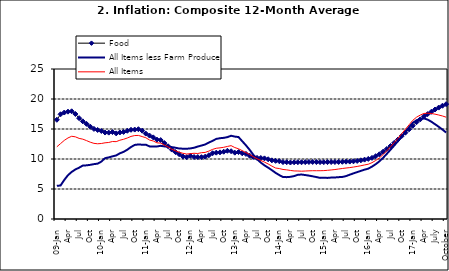
| Category | Food | All Items less Farm Produce | All Items |
|---|---|---|---|
| 09-Jan | 16.536 | 5.519 | 12.032 |
| Feb | 17.454 | 5.591 | 12.567 |
| Mar | 17.742 | 6.51 | 13.101 |
| Apr | 17.89 | 7.302 | 13.51 |
| May | 17.949 | 7.847 | 13.787 |
| June | 17.498 | 8.259 | 13.694 |
| Jul | 16.808 | 8.554 | 13.437 |
| Aug | 16.278 | 8.906 | 13.307 |
| Sep | 15.859 | 8.942 | 13.065 |
| Oct | 15.396 | 9.024 | 12.803 |
| Nov | 15.018 | 9.143 | 12.609 |
| Dec | 14.841 | 9.226 | 12.538 |
| 10-Jan | 14.668 | 9.567 | 12.586 |
| Feb | 14.411 | 10.138 | 12.7 |
| Mar | 14.395 | 10.269 | 12.757 |
| Apr | 14.489 | 10.444 | 12.915 |
| May | 14.266 | 10.597 | 12.893 |
| Jun | 14.424 | 10.948 | 13.132 |
| Jul | 14.514 | 11.193 | 13.284 |
| Aug | 14.706 | 11.549 | 13.5 |
| Sep | 14.872 | 11.997 | 13.764 |
| Oct | 14.906 | 12.345 | 13.908 |
| Nov | 14.967 | 12.423 | 13.928 |
| Dec | 14.723 | 12.383 | 13.74 |
| 11-Jan | 14.233 | 12.385 | 13.542 |
| Feb | 13.903 | 12.099 | 13.161 |
| Mar | 13.606 | 12.077 | 13.001 |
| Apr | 13.227 | 12.088 | 12.694 |
| May | 13.152 | 12.198 | 12.648 |
| Jun | 12.654 | 12.1 | 12.321 |
| Jul | 12.118 | 12.109 | 12.009 |
| Aug | 11.575 | 11.98 | 11.635 |
| Sep | 11.155 | 11.877 | 11.363 |
| Oct | 10.797 | 11.746 | 11.13 |
| Nov | 10.422 | 11.721 | 10.952 |
| Dec | 10.298 | 11.706 | 10.826 |
| 12-Jan | 10.538 | 11.765 | 10.886 |
| 12-Feb | 10.336 | 11.872 | 10.955 |
| 12-Mar | 10.325 | 12.075 | 10.914 |
| Apr | 10.304 | 12.242 | 11.054 |
| May | 10.387 | 12.419 | 11.096 |
| Jun | 10.617 | 12.732 | 11.32 |
| Jul | 10.963 | 13.032 | 11.599 |
| Aug | 11.056 | 13.349 | 11.791 |
| Sep | 11.104 | 13.467 | 11.859 |
| Oct | 11.216 | 13.525 | 11.948 |
| Nov | 11.372 | 13.649 | 12.091 |
| Dec | 11.296 | 13.873 | 12.224 |
| 13-Jan | 11.055 | 13.737 | 11.908 |
| Feb | 11.153 | 13.657 | 11.703 |
| Mar | 10.951 | 12.963 | 11.394 |
| Apr | 10.844 | 12.281 | 11.072 |
| May | 10.548 | 11.531 | 10.761 |
| Jun | 10.352 | 10.704 | 10.383 |
| Jul | 10.186 | 10.005 | 10.047 |
| Aug | 10.168 | 9.4 | 9.761 |
| Sep | 10.105 | 8.939 | 9.486 |
| Oct | 9.955 | 8.553 | 9.167 |
| Nov | 9.774 | 8.136 | 8.815 |
| Dec | 9.695 | 7.691 | 8.496 |
| 14-Jan | 9.626 | 7.317 | 8.408 |
| Feb | 9.484 | 7.005 | 8.257 |
| Mar | 9.464 | 6.976 | 8.19 |
| Apr | 9.416 | 7.03 | 8.092 |
| May | 9.448 | 7.151 | 8.012 |
| Jun | 9.464 | 7.369 | 7.998 |
| Jul | 9.459 | 7.411 | 7.968 |
| Aug | 9.481 | 7.325 | 7.996 |
| Sep | 9.501 | 7.228 | 8.027 |
| Oct | 9.508 | 7.116 | 8.047 |
| Nov | 9.492 | 6.991 | 8.046 |
| Dec | 9.481 | 6.854 | 8.047 |
| 15-Jan | 9.475 | 6.865 | 8.063 |
| Feb | 9.486 | 6.852 | 8.117 |
| Mar | 9.495 | 6.905 | 8.176 |
| Apr | 9.501 | 6.922 | 8.243 |
| May | 9.51 | 6.975 | 8.331 |
| Jun | 9.535 | 7.006 | 8.417 |
| Jul | 9.552 | 7.154 | 8.497 |
| Aug | 9.571 | 7.384 | 8.566 |
| Sep | 9.614 | 7.605 | 8.658 |
| Oct | 9.68 | 7.812 | 8.76 |
| Nov | 9.778 | 8.016 | 8.879 |
| Dec | 9.898 | 8.222 | 9.009 |
| 16-Jan | 10.017 | 8.391 | 9.13 |
| Feb | 10.184 | 8.732 | 9.386 |
| Mar | 10.471 | 9.132 | 9.751 |
| Apr | 10.786 | 9.614 | 10.182 |
| May | 11.221 | 10.196 | 10.746 |
| Jun | 11.672 | 10.864 | 11.372 |
| Jul | 12.162 | 11.553 | 12.045 |
| Aug | 12.696 | 12.247 | 12.744 |
| Sep | 13.238 | 12.98 | 13.454 |
| Oct | 13.817 | 13.757 | 14.206 |
| Nov | 14.386 | 14.542 | 14.958 |
| Dec | 14.946 | 15.307 | 15.697 |
| 17-Jan | 15.536 | 16.042 | 16.441 |
| Feb | 16.127 | 16.436 | 16.958 |
| Mar | 16.598 | 16.682 | 17.315 |
| Apr | 17.106 | 16.772 | 17.591 |
| May | 17.477 | 16.567 | 17.628 |
| June | 17.868 | 16.219 | 17.578 |
| July | 18.247 | 15.798 | 17.475 |
| August | 18.569 | 15.372 | 17.331 |
| September | 18.876 | 14.903 | 17.17 |
| October | 19.14 | 14.415 | 16.968 |